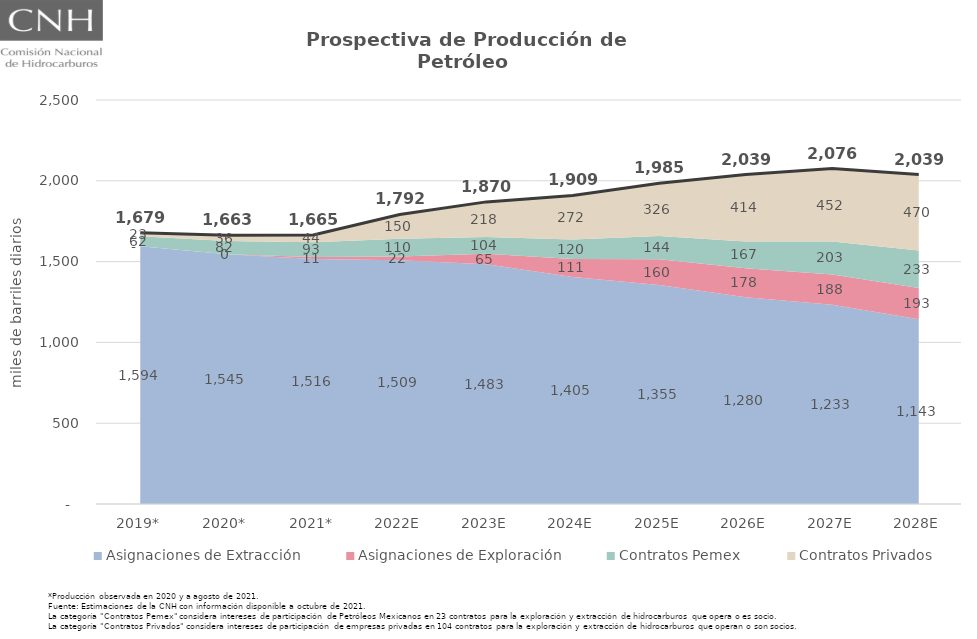
| Category | Total |
|---|---|
| 2019* | 1678.832 |
| 2020* | 1663.043 |
| 2021* | 1664.708 |
| 2022E | 1791.537 |
| 2023E | 1869.509 |
| 2024E | 1909.273 |
| 2025E | 1984.629 |
| 2026E | 2038.798 |
| 2027E | 2075.785 |
| 2028E | 2038.833 |